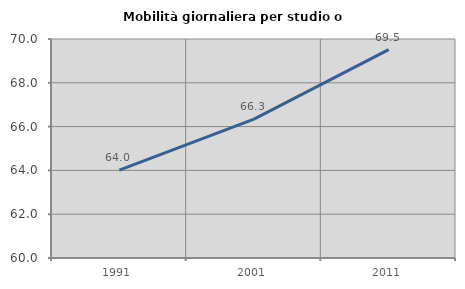
| Category | Mobilità giornaliera per studio o lavoro |
|---|---|
| 1991.0 | 64.013 |
| 2001.0 | 66.344 |
| 2011.0 | 69.516 |